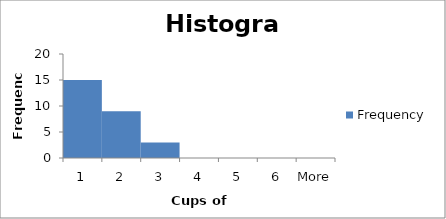
| Category | Frequency |
|---|---|
| 1 | 15 |
| 2 | 9 |
| 3 | 3 |
| 4 | 0 |
| 5 | 0 |
| 6 | 0 |
| More | 0 |